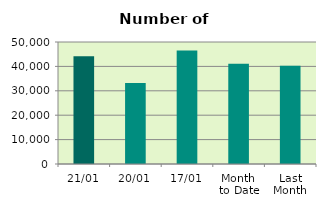
| Category | Series 0 |
|---|---|
| 21/01 | 44126 |
| 20/01 | 33176 |
| 17/01 | 46520 |
| Month 
to Date | 41119.571 |
| Last
Month | 40313.8 |